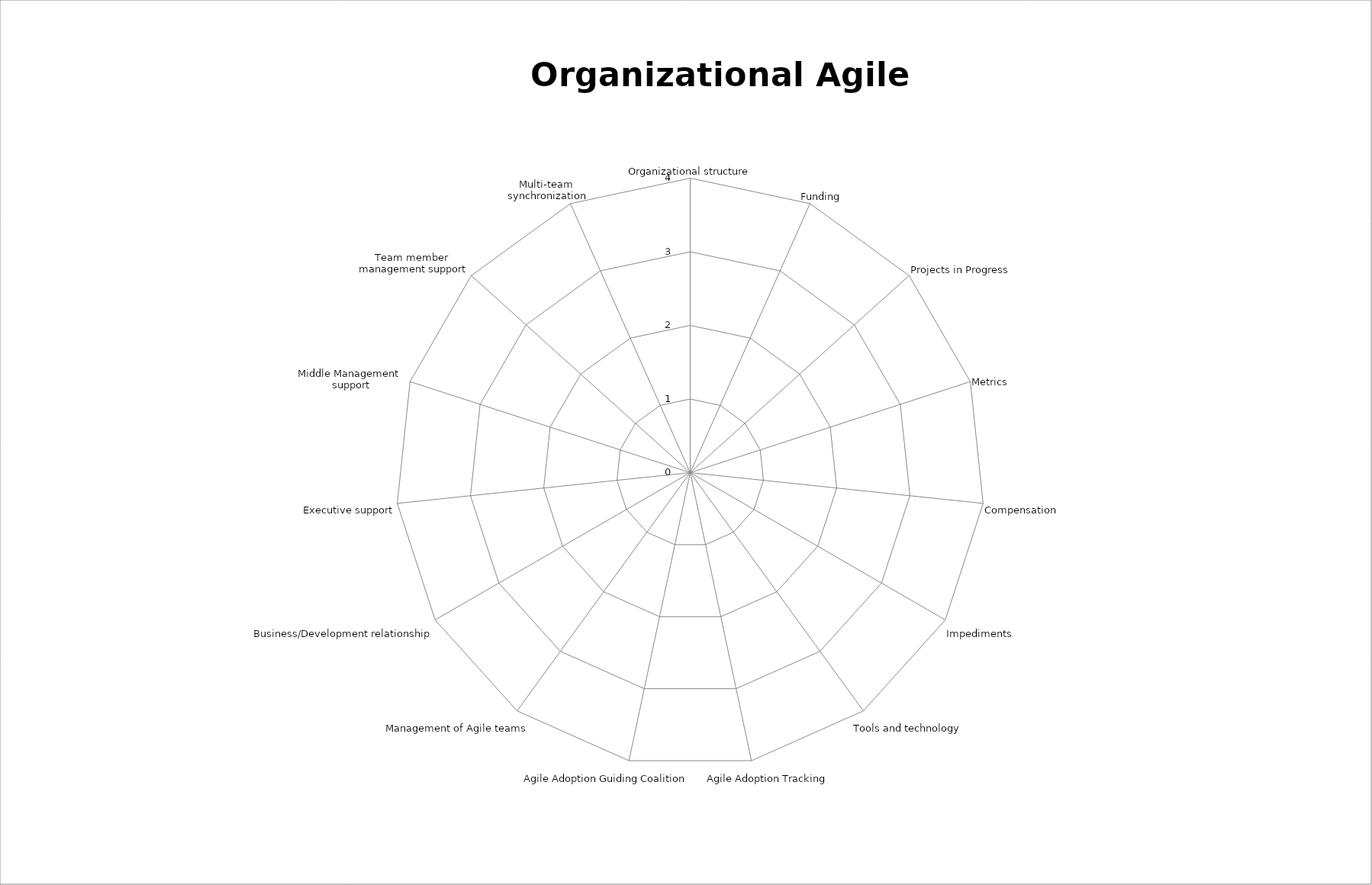
| Category | Series 0 |
|---|---|
| _x000d_Organizational structure | 0 |
| _x000d_Funding | 0 |
| _x000d_Projects in Progress | 0 |
| _x000d_Metrics | 0 |
| _x000d_Compensation | 0 |
| _x000d_Impediments | 0 |
| _x000d_Tools and technology | 0 |
| _x000d_Agile Adoption Tracking | 0 |
| _x000d_Agile Adoption Guiding Coalition | 0 |
| _x000d_Management of Agile teams | 0 |
| _x000d_Business/Development relationship | 0 |
| _x000d_Executive support | 0 |
| _x000d_Middle Management _x000d_support | 0 |
| _x000d_Team member _x000d_management support | 0 |
| _x000d_Multi-team _x000d_synchronization | 0 |